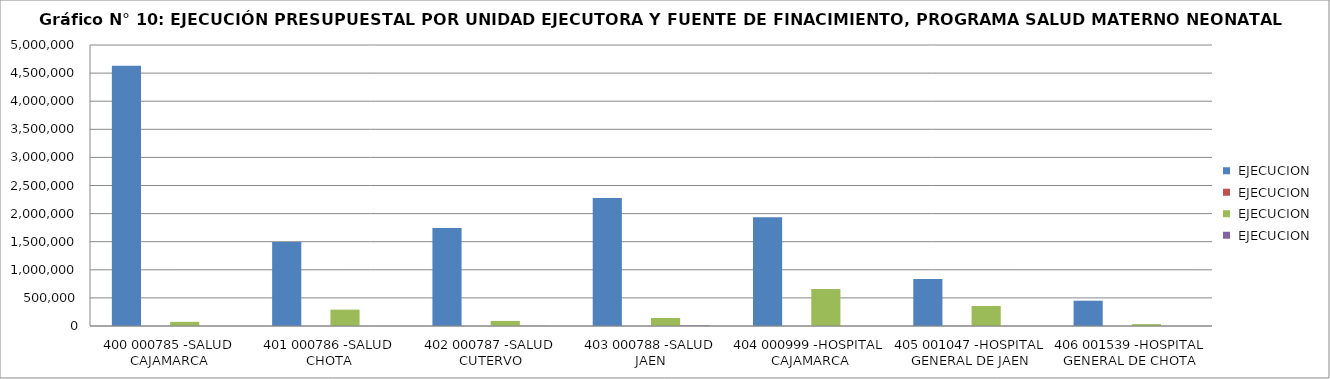
| Category | RECURSOS ORDINARIOS EJECUCION | RECURSOS DIRECTAMENTE RECAUDADOS EJECUCION | DONACIONES Y TRANSFERENCIAS EJECUCION | RECURSOS DETERMINADOS EJECUCION |
|---|---|---|---|---|
| 400 000785 -SALUD CAJAMARCA | 4631124 | 720 | 73953 | 0 |
| 401 000786 -SALUD CHOTA | 1493091 | 0 | 290999 | 70 |
| 402 000787 -SALUD CUTERVO | 1742388 | 0 | 90376 | 2130 |
| 403 000788 -SALUD JAEN | 2277427 | 0 | 142392 | 9660 |
| 404 000999 -HOSPITAL CAJAMARCA | 1934322 | 0 | 659726 | 0 |
| 405 001047 -HOSPITAL GENERAL DE JAEN | 838459 | 2798 | 355323 | 0 |
| 406 001539 -HOSPITAL GENERAL DE CHOTA | 450129 | 0 | 33554 | 0 |